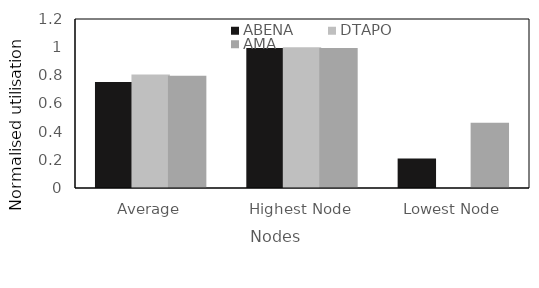
| Category | ABENA | DTAPO | AMA |
|---|---|---|---|
| Average | 0.753 | 0.806 | 0.797 |
| Highest Node | 0.995 | 1 | 0.995 |
| Lowest Node | 0.21 | 0 | 0.464 |